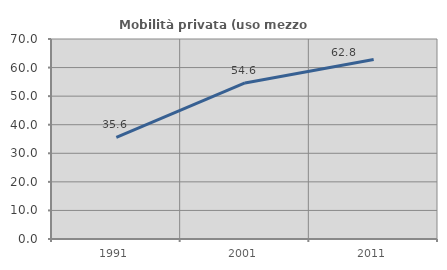
| Category | Mobilità privata (uso mezzo privato) |
|---|---|
| 1991.0 | 35.597 |
| 2001.0 | 54.61 |
| 2011.0 | 62.804 |